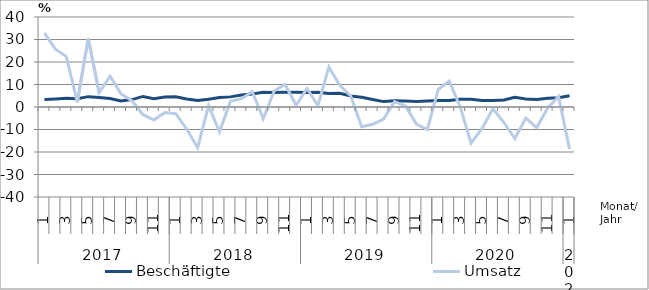
| Category | Beschäftigte | Umsatz |
|---|---|---|
| 0 | 3.3 | 32.8 |
| 1 | 3.6 | 25.7 |
| 2 | 3.9 | 22.4 |
| 3 | 3.7 | 2.1 |
| 4 | 4.6 | 30.4 |
| 5 | 4.2 | 6.4 |
| 6 | 3.8 | 13.7 |
| 7 | 2.7 | 5.8 |
| 8 | 3.3 | 2.8 |
| 9 | 4.7 | -3.4 |
| 10 | 3.7 | -5.8 |
| 11 | 4.4 | -2.5 |
| 12 | 4.5 | -3 |
| 13 | 3.6 | -9.8 |
| 14 | 2.9 | -18.1 |
| 15 | 3.4 | 0.5 |
| 16 | 4.2 | -11 |
| 17 | 4.5 | 2.5 |
| 18 | 5.3 | 3.7 |
| 19 | 5.8 | 6.8 |
| 20 | 6.6 | -5.2 |
| 21 | 6.5 | 7.1 |
| 22 | 6.6 | 10.1 |
| 23 | 6.6 | 0.8 |
| 24 | 6.4 | 8.2 |
| 25 | 6.5 | 0.6 |
| 26 | 6 | 17.8 |
| 27 | 6.1 | 9.6 |
| 28 | 4.9 | 4.9 |
| 29 | 4.3 | -8.8 |
| 30 | 3.3 | -7.7 |
| 31 | 2.4 | -5.4 |
| 32 | 2.8 | 2.4 |
| 33 | 2.7 | 0.5 |
| 34 | 2.5 | -7.6 |
| 35 | 2.7 | -10 |
| 36 | 2.9 | 7.8 |
| 37 | 2.9 | 11.5 |
| 38 | 3.4 | 0.1 |
| 39 | 3.4 | -16.1 |
| 40 | 2.9 | -9.5 |
| 41 | 2.9 | -0.8 |
| 42 | 3.1 | -6.9 |
| 43 | 4.3 | -14 |
| 44 | 3.6 | -4.9 |
| 45 | 3.3 | -9.2 |
| 46 | 3.9 | -0.4 |
| 47 | 4.1 | 4.6 |
| 48 | 5 | -18.7 |